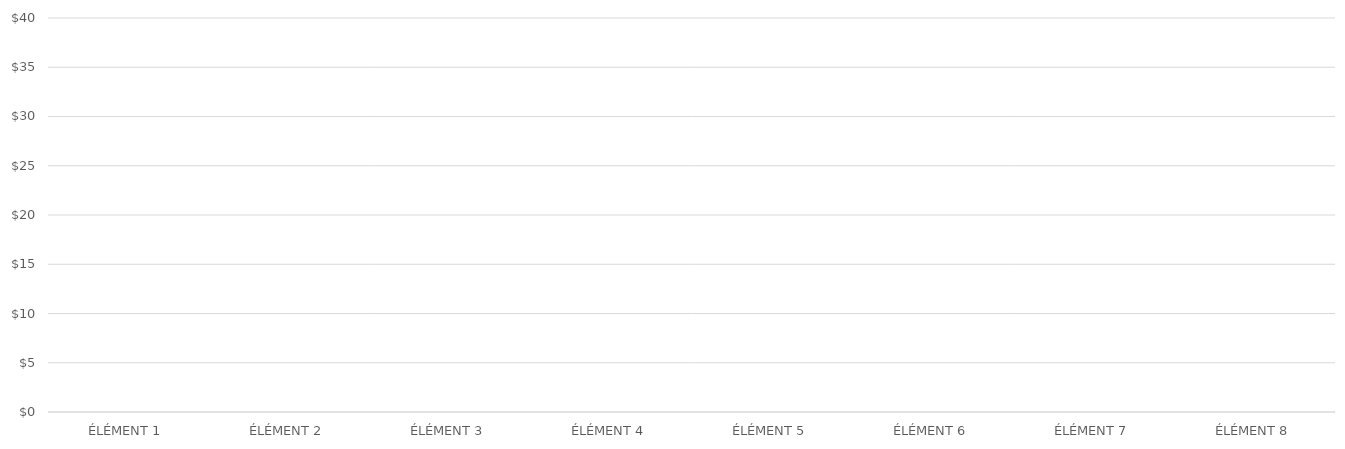
| Category | BÉNÉFICE PAR ÉLÉMENT |
|---|---|
| ÉLÉMENT 1 | 0 |
| ÉLÉMENT 2 | 0 |
| ÉLÉMENT 3 | 0 |
| ÉLÉMENT 4 | 0 |
| ÉLÉMENT 5 | 0 |
| ÉLÉMENT 6 | 0 |
| ÉLÉMENT 7 | 0 |
| ÉLÉMENT 8 | 0 |